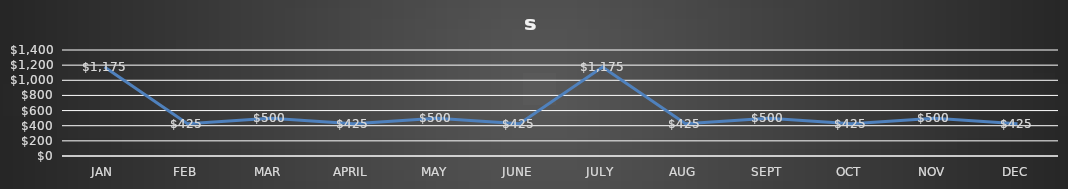
| Category | Series 0 |
|---|---|
| JAN | 1175 |
| FEB | 425 |
| MAR | 500 |
| APRIL | 425 |
| MAY | 500 |
| JUNE | 425 |
| JULY | 1175 |
| AUG | 425 |
| SEPT | 500 |
| OCT | 425 |
| NOV | 500 |
| DEC | 425 |